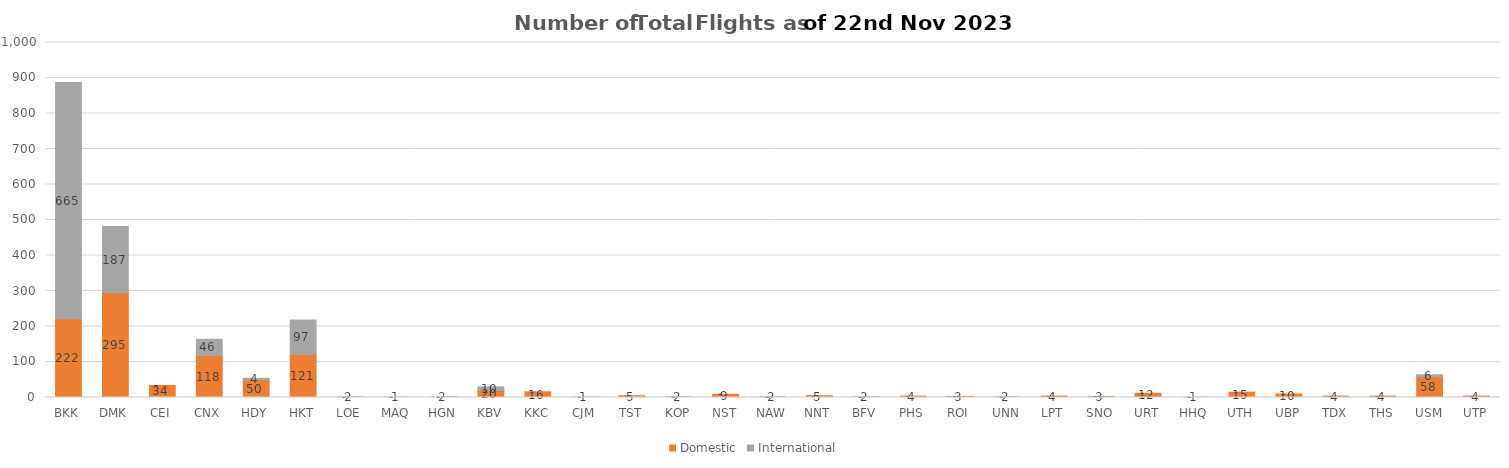
| Category | Domestic | International |
|---|---|---|
| BKK | 222 | 665 |
| DMK | 295 | 187 |
| CEI | 34 | 0 |
| CNX | 118 | 46 |
| HDY | 50 | 4 |
| HKT | 121 | 97 |
| LOE | 2 | 0 |
| MAQ | 1 | 0 |
| HGN | 2 | 0 |
| KBV | 20 | 10 |
| KKC | 16 | 0 |
| CJM | 1 | 0 |
| TST | 5 | 0 |
| KOP | 2 | 0 |
| NST | 9 | 0 |
| NAW | 2 | 0 |
| NNT | 5 | 0 |
| BFV | 2 | 0 |
| PHS | 4 | 0 |
| ROI | 3 | 0 |
| UNN | 2 | 0 |
| LPT | 4 | 0 |
| SNO | 3 | 0 |
| URT | 12 | 0 |
| HHQ | 1 | 0 |
| UTH | 15 | 0 |
| UBP | 10 | 0 |
| TDX | 4 | 0 |
| THS | 4 | 0 |
| USM | 58 | 6 |
| UTP | 4 | 0 |